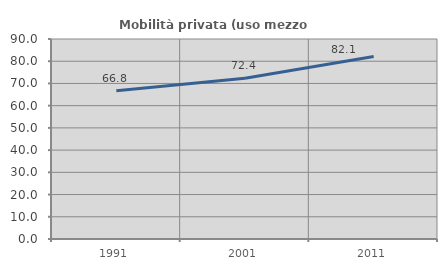
| Category | Mobilità privata (uso mezzo privato) |
|---|---|
| 1991.0 | 66.753 |
| 2001.0 | 72.362 |
| 2011.0 | 82.128 |